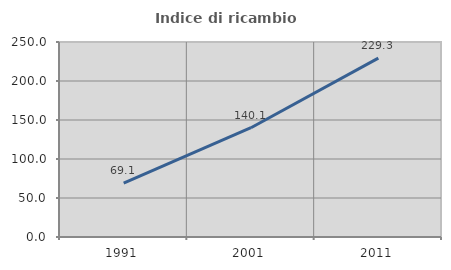
| Category | Indice di ricambio occupazionale  |
|---|---|
| 1991.0 | 69.118 |
| 2001.0 | 140.107 |
| 2011.0 | 229.31 |